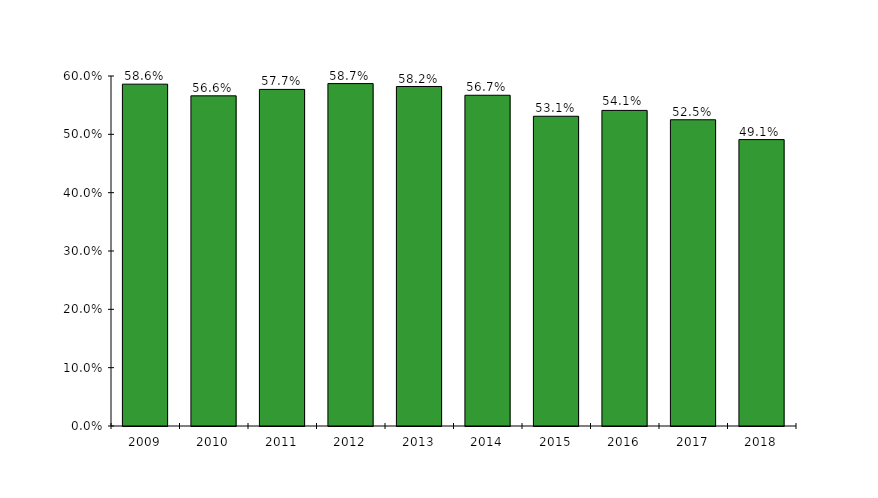
| Category | Series 0 |
|---|---|
| 2009.0 | 0.586 |
| 2010.0 | 0.566 |
| 2011.0 | 0.577 |
| 2012.0 | 0.587 |
| 2013.0 | 0.582 |
| 2014.0 | 0.567 |
| 2015.0 | 0.531 |
| 2016.0 | 0.541 |
| 2017.0 | 0.525 |
| 2018.0 | 0.491 |